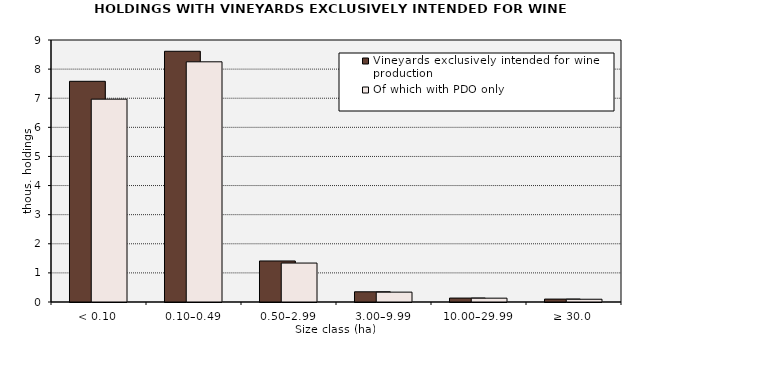
| Category | Vineyards exclusively intended for wine production | Of which with PDO only |
|---|---|---|
| < 0.10 | 7581 | 6968 |
| 0.10–0.49 | 8613 | 8251 |
| 0.50–2.99 | 1410 | 1338 |
| 3.00–9.99 | 350 | 339 |
| 10.00–29.99 | 135 | 132 |
| ≥ 30.0 | 100 | 95 |